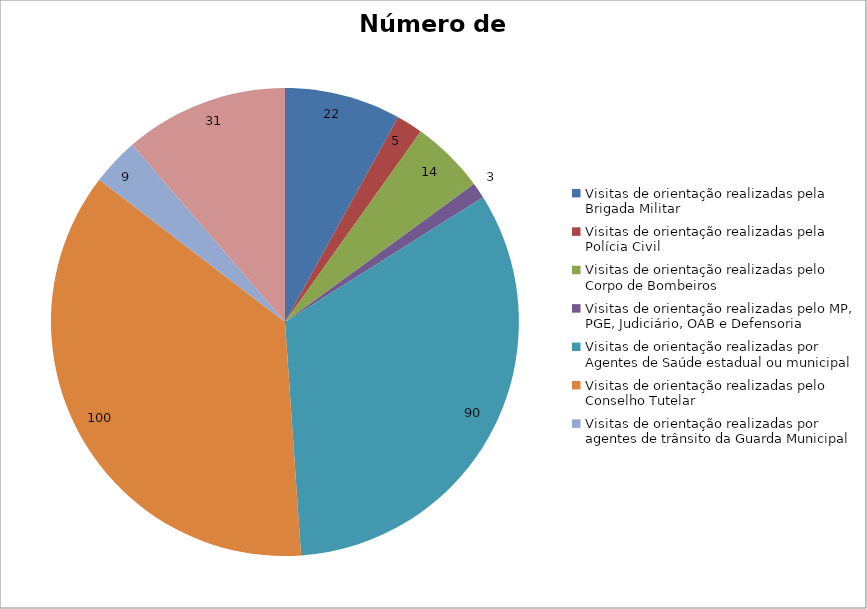
| Category | Número de Ações |
|---|---|
| Visitas de orientação realizadas pela Brigada Militar | 22 |
| Visitas de orientação realizadas pela Polícia Civil | 5 |
| Visitas de orientação realizadas pelo Corpo de Bombeiros | 14 |
| Visitas de orientação realizadas pelo MP, PGE, Judiciário, OAB e Defensoria | 3 |
| Visitas de orientação realizadas por Agentes de Saúde estadual ou municipal | 90 |
| Visitas de orientação realizadas pelo Conselho Tutelar | 100 |
| Visitas de orientação realizadas por agentes de trânsito da Guarda Municipal | 9 |
| Visitas de orientação realizadas por ONGs, entidades privadas, CRAS e CREAS | 31 |